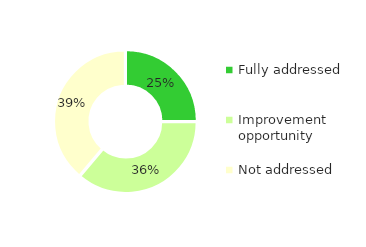
| Category | Series 0 |
|---|---|
| Fully addressed | 0.25 |
| Improvement opportunity | 0.361 |
| Not addressed | 0.389 |